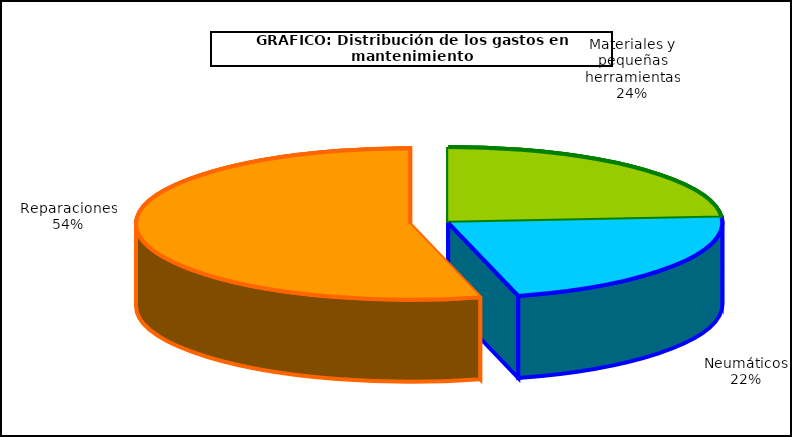
| Category | Series 0 |
|---|---|
| 0 | 369.986 |
| 1 | 340.215 |
| 2 | 837.62 |